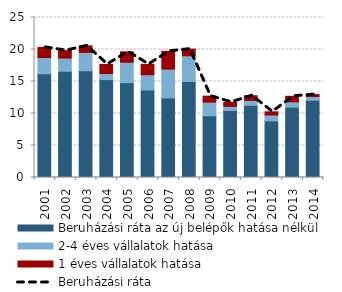
| Category | Beruházási ráta az új belépők hatása nélkül | 2-4 éves vállalatok hatása | 1 éves vállalatok hatása |
|---|---|---|---|
| 2001.0 | 16.209 | 2.541 | 1.579 |
| 2002.0 | 16.599 | 2.062 | 1.164 |
| 2003.0 | 16.682 | 2.863 | 1.024 |
| 2004.0 | 15.297 | 0.953 | 1.428 |
| 2005.0 | 14.821 | 3.194 | 1.623 |
| 2006.0 | 13.67 | 2.391 | 1.615 |
| 2007.0 | 12.436 | 4.502 | 2.773 |
| 2008.0 | 15 | 4.021 | 1.038 |
| 2009.0 | 9.643 | 2.135 | 0.935 |
| 2010.0 | 10.475 | 0.646 | 0.637 |
| 2011.0 | 11.284 | 0.759 | 0.73 |
| 2012.0 | 8.842 | 0.92 | 0.501 |
| 2013.0 | 10.994 | 0.831 | 0.859 |
| 2014.0 | 12.081 | 0.568 | 0.307 |